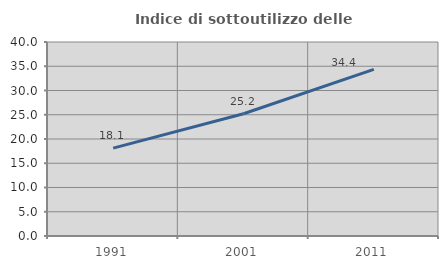
| Category | Indice di sottoutilizzo delle abitazioni  |
|---|---|
| 1991.0 | 18.122 |
| 2001.0 | 25.207 |
| 2011.0 | 34.368 |